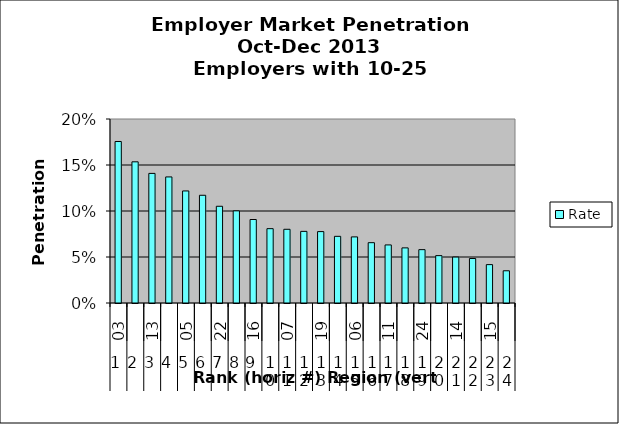
| Category | Rate |
|---|---|
| 0 | 0.176 |
| 1 | 0.153 |
| 2 | 0.141 |
| 3 | 0.137 |
| 4 | 0.122 |
| 5 | 0.117 |
| 6 | 0.105 |
| 7 | 0.1 |
| 8 | 0.091 |
| 9 | 0.081 |
| 10 | 0.08 |
| 11 | 0.078 |
| 12 | 0.078 |
| 13 | 0.072 |
| 14 | 0.072 |
| 15 | 0.066 |
| 16 | 0.063 |
| 17 | 0.06 |
| 18 | 0.058 |
| 19 | 0.051 |
| 20 | 0.05 |
| 21 | 0.048 |
| 22 | 0.042 |
| 23 | 0.035 |